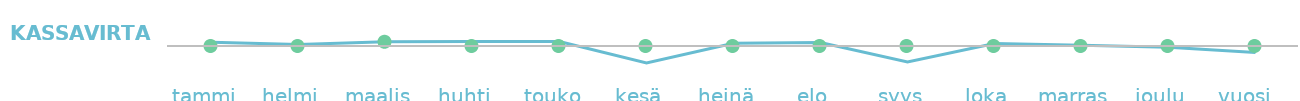
| Category | Kassavirta |
|---|---|
| tammi  | 169 |
| helmi  | 69 |
| maalis  | 192 |
| huhti  | 199 |
| touko  | 204 |
| kesä  | -771 |
| heinä  | 124 |
| elo  | 154 |
| syys  | -721 |
| loka  | 109 |
| marras  | 34 |
| joulu  | -61 |
| vuosi   | -299 |